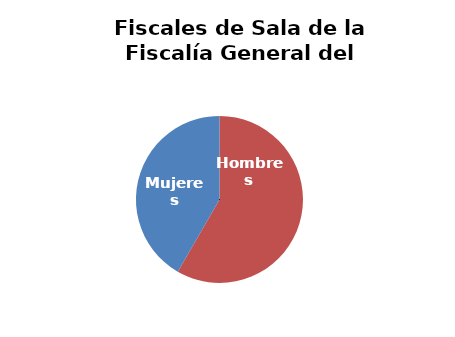
| Category | Fiscales de Sala de la Fiscalía General del Estado |
|---|---|
| Hombres | 7 |
| Mujeres | 5 |